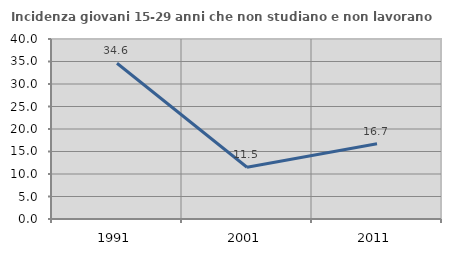
| Category | Incidenza giovani 15-29 anni che non studiano e non lavorano  |
|---|---|
| 1991.0 | 34.615 |
| 2001.0 | 11.506 |
| 2011.0 | 16.742 |